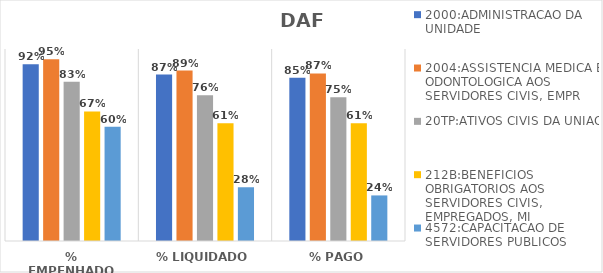
| Category | 2000:ADMINISTRACAO DA UNIDADE | 2004:ASSISTENCIA MEDICA E ODONTOLOGICA AOS SERVIDORES CIVIS, EMPR | 20TP:ATIVOS CIVIS DA UNIAO | 212B:BENEFICIOS OBRIGATORIOS AOS SERVIDORES CIVIS, EMPREGADOS, MI | 4572:CAPACITACAO DE SERVIDORES PUBLICOS FEDERAIS EM PROCESSO DE Q |
|---|---|---|---|---|---|
| % EMPENHADO | 0.92 | 0.946 | 0.83 | 0.675 | 0.595 |
| % LIQUIDADO | 0.867 | 0.888 | 0.76 | 0.614 | 0.28 |
| % PAGO | 0.85 | 0.873 | 0.748 | 0.613 | 0.237 |